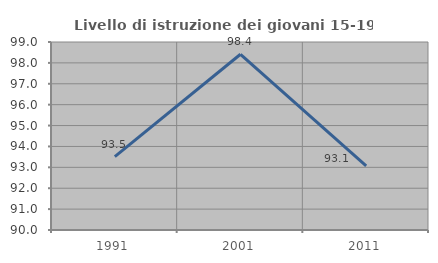
| Category | Livello di istruzione dei giovani 15-19 anni |
|---|---|
| 1991.0 | 93.514 |
| 2001.0 | 98.413 |
| 2011.0 | 93.069 |